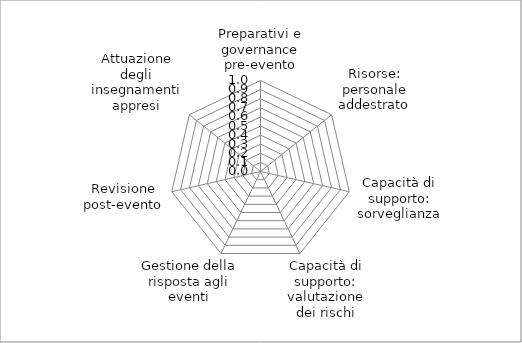
| Category | Series 0 |
|---|---|
| Preparativi e governance pre-evento | 0 |
| Risorse: personale addestrato | 0 |
| Capacità di supporto: sorveglianza | 0 |
| Capacità di supporto: valutazione dei rischi | 0 |
| Gestione della risposta agli eventi | 0 |
| Revisione post-evento | 0 |
| Attuazione degli insegnamenti appresi | 0 |